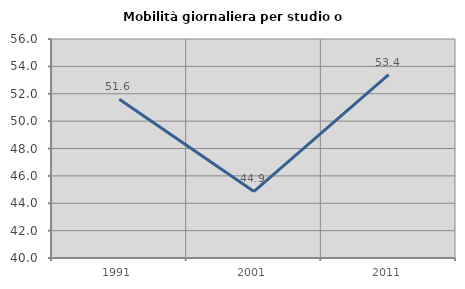
| Category | Mobilità giornaliera per studio o lavoro |
|---|---|
| 1991.0 | 51.592 |
| 2001.0 | 44.862 |
| 2011.0 | 53.39 |